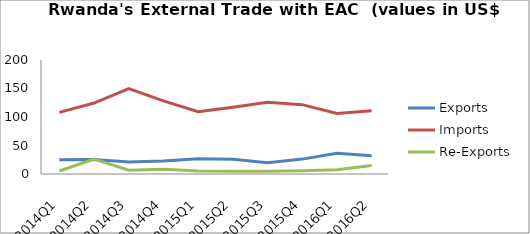
| Category | Exports | Imports | Re-Exports |
|---|---|---|---|
| 2014Q1 | 24.967 | 108.187 | 5.315 |
| 2014Q2 | 25.448 | 124.453 | 26.344 |
| 2014Q3 | 21.18 | 149.827 | 6.525 |
| 2014Q4 | 22.973 | 128.216 | 8.164 |
| 2015Q1 | 26.831 | 109.19 | 5.342 |
| 2015Q2 | 25.726 | 116.975 | 4.792 |
| 2015Q3 | 19.654 | 125.948 | 4.643 |
| 2015Q4 | 26.132 | 121.64 | 5.76 |
| 2016Q1 | 36.445 | 106.236 | 7.434 |
| 2016Q2 | 32.158 | 111.171 | 15.106 |